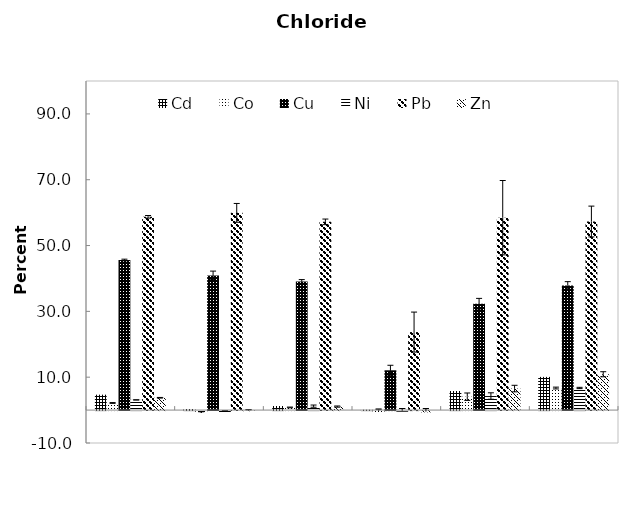
| Category | Cd | Co | Cu | Ni | Pb | Zn |
|---|---|---|---|---|---|---|
| 1.5 | 4.689 | 2.161 | 45.612 | 3.094 | 58.728 | 3.743 |
| 3.5 | 0.336 | -0.872 | 40.927 | -0.357 | 59.932 | -0.037 |
| 5.5 | 1.237 | 0.801 | 39.085 | 1.2 | 57.203 | 1.063 |
| 7.5 | 0.118 | -0.313 | 12.095 | -0.194 | 23.704 | -0.383 |
| 9.5 | 5.8 | 4.07 | 32.34 | 4.269 | 58.465 | 6.539 |
| 11.5 | 10.092 | 6.699 | 37.854 | 6.724 | 57.301 | 10.888 |